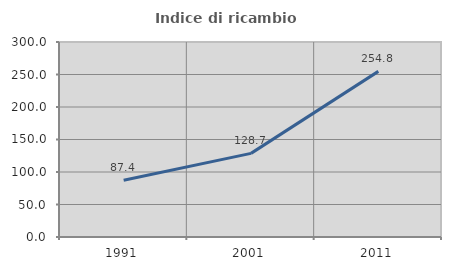
| Category | Indice di ricambio occupazionale  |
|---|---|
| 1991.0 | 87.442 |
| 2001.0 | 128.662 |
| 2011.0 | 254.808 |